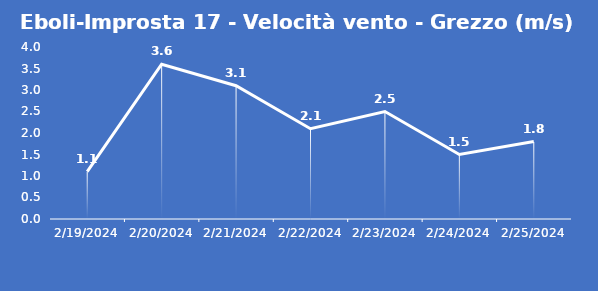
| Category | Eboli-Improsta 17 - Velocità vento - Grezzo (m/s) |
|---|---|
| 2/19/24 | 1.1 |
| 2/20/24 | 3.6 |
| 2/21/24 | 3.1 |
| 2/22/24 | 2.1 |
| 2/23/24 | 2.5 |
| 2/24/24 | 1.5 |
| 2/25/24 | 1.8 |